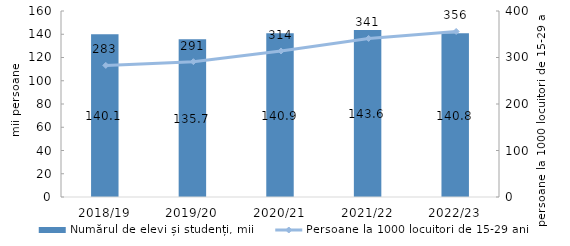
| Category | Numărul de elevi și studenți, mii |
|---|---|
| 2018/19 | 140.1 |
| 2019/20 | 135.7 |
| 2020/21 | 140.9 |
| 2021/22 | 143.6 |
| 2022/23 | 140.8 |